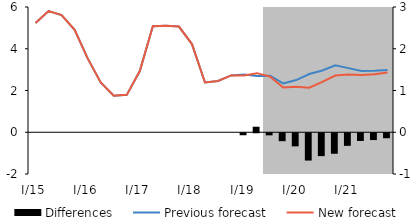
| Category | Differences |
|---|---|
| I/15 | 0 |
| II | 0 |
| III | 0 |
| IV | 0 |
| I/16 | 0 |
| II | 0 |
| III | 0 |
| IV | 0 |
| I/17 | 0 |
| II | 0 |
| III | 0 |
| IV | 0 |
| I/18 | 0 |
| II | 0 |
| III | 0 |
| IV | 0 |
| I/19 | -0.048 |
| II | 0.132 |
| III | -0.05 |
| IV | -0.19 |
| I/20 | -0.314 |
| II | -0.654 |
| III | -0.548 |
| IV | -0.491 |
| I/21 | -0.302 |
| II | -0.185 |
| III | -0.163 |
| IV | -0.12 |